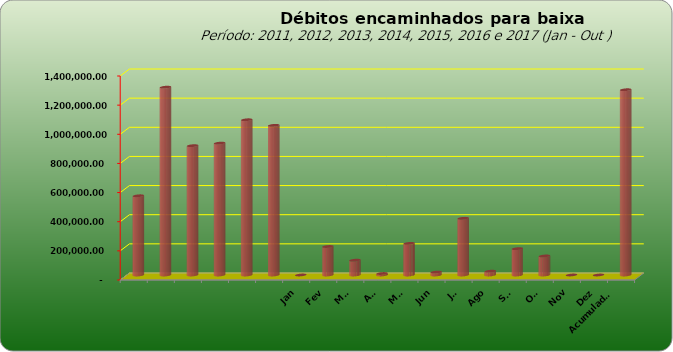
| Category |  543.796,20  |
|---|---|
|  | 543796.2 |
|  | 1289053.69 |
|  | 887573.08 |
|  | 905052.31 |
|  | 1065434.28 |
|  | 1027209.41 |
| Jan | 0 |
| Fev | 195564.55 |
| Mar | 101757.11 |
| Abr | 10195.55 |
| Mai | 217067.29 |
| Jun | 19848.93 |
| Jul | 389298.76 |
| Ago | 26234.02 |
| Set | 180838.97 |
| Out | 130731.84 |
| Nov | 0 |
| Dez | 0 |
| Acumulado
2016 | 1271537.02 |